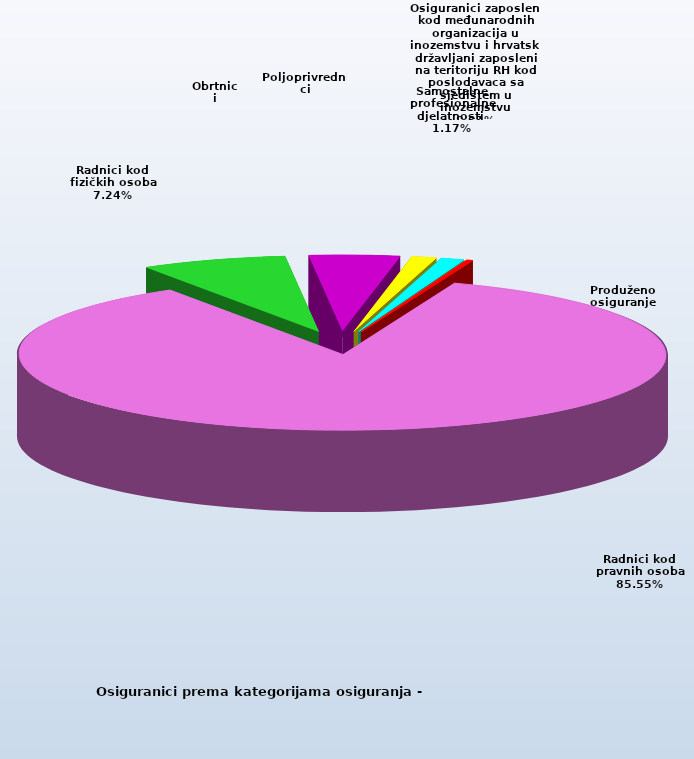
| Category | Series 0 |
|---|---|
| Radnici kod pravnih osoba | 1329781 |
| Radnici kod fizičkih osoba | 112578 |
| Obrtnici | 69845 |
| Poljoprivrednici | 19163 |
| Samostalne profesionalne djelatnosti  | 18225 |
| Osiguranici zaposleni kod međunarodnih organizacija u inozemstvu i hrvatski državljani zaposleni na teritoriju RH kod poslodavaca sa sjedištem u inozemstvu | 79 |
| Produženo osiguranje | 4659 |